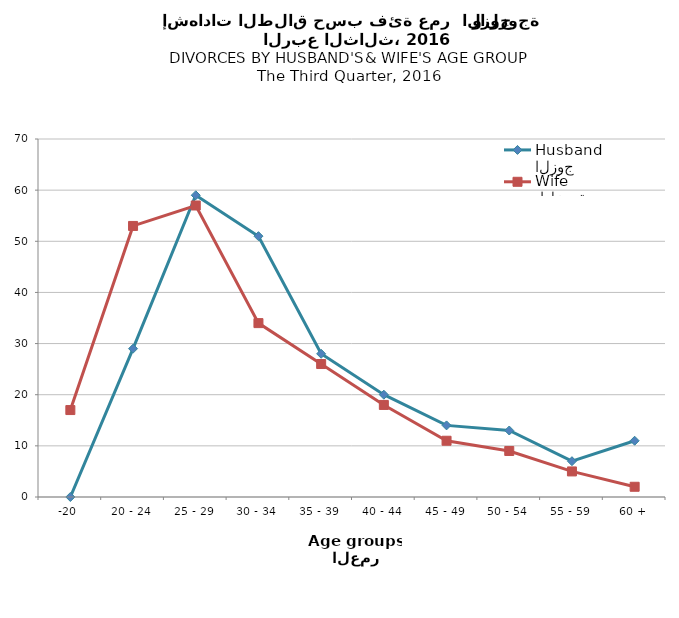
| Category | الزوج
Husband |  الزوجة
Wife |
|---|---|---|
| -20 | 0 | 17 |
| 20 - 24 | 29 | 53 |
| 25 - 29 | 59 | 57 |
| 30 - 34 | 51 | 34 |
| 35 - 39 | 28 | 26 |
| 40 - 44 | 20 | 18 |
| 45 - 49 | 14 | 11 |
| 50 - 54 | 13 | 9 |
| 55 - 59 | 7 | 5 |
| 60 + | 11 | 2 |